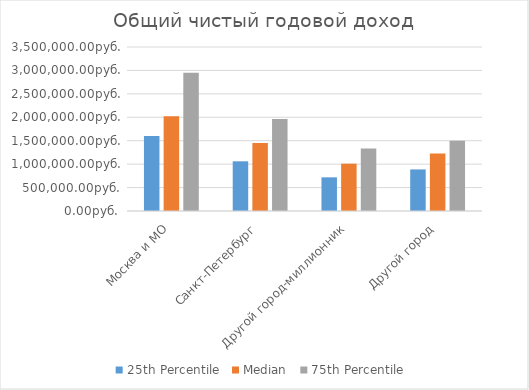
| Category | 25th Percentile  | Median  | 75th Percentile  |
|---|---|---|---|
| Москва и МО | 1602500 | 2021000 | 2950000 |
| Санкт-Петербург | 1060500 | 1450000 | 1965000 |
| Другой город-миллионник | 718500 | 1010000 | 1333500 |
| Другой город | 887500 | 1227000 | 1500000 |